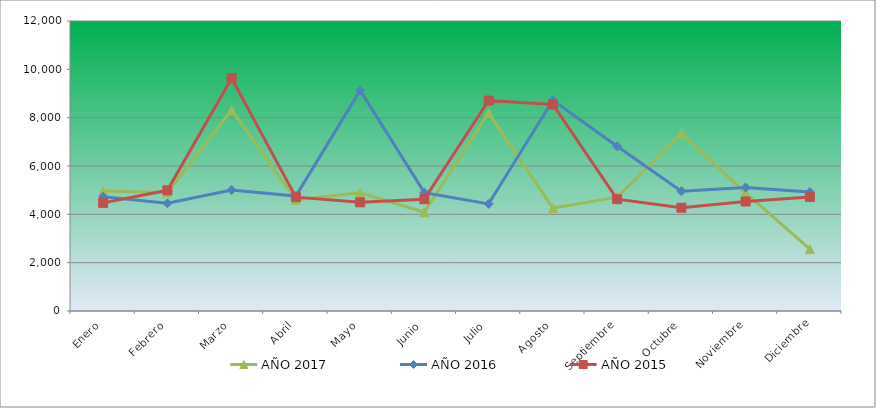
| Category | AÑO 2017 | AÑO 2016 | AÑO 2015 |
|---|---|---|---|
| Enero | 4963.462 | 4730.547 | 4473.151 |
| Febrero | 4902.784 | 4455.097 | 4993.835 |
| Marzo | 8312.889 | 5005.997 | 9632.658 |
| Abril | 4599.394 | 4754.499 | 4709.826 |
| Mayo | 4890.649 | 9125.764 | 4496.818 |
| Junio | 4089.699 | 4898.212 | 4626.989 |
| Julio | 8191.533 | 4431.145 | 8709.627 |
| Agosto | 4259.597 | 8718.578 | 8543.955 |
| Septiembre | 4708.614 | 6814.383 | 4626.989 |
| Octubre | 7342.041 | 4958.092 | 4271.977 |
| Noviembre | 4890.649 | 5113.781 | 4532.32 |
| Diciembre | 2560.613 | 4922.164 | 4721.659 |